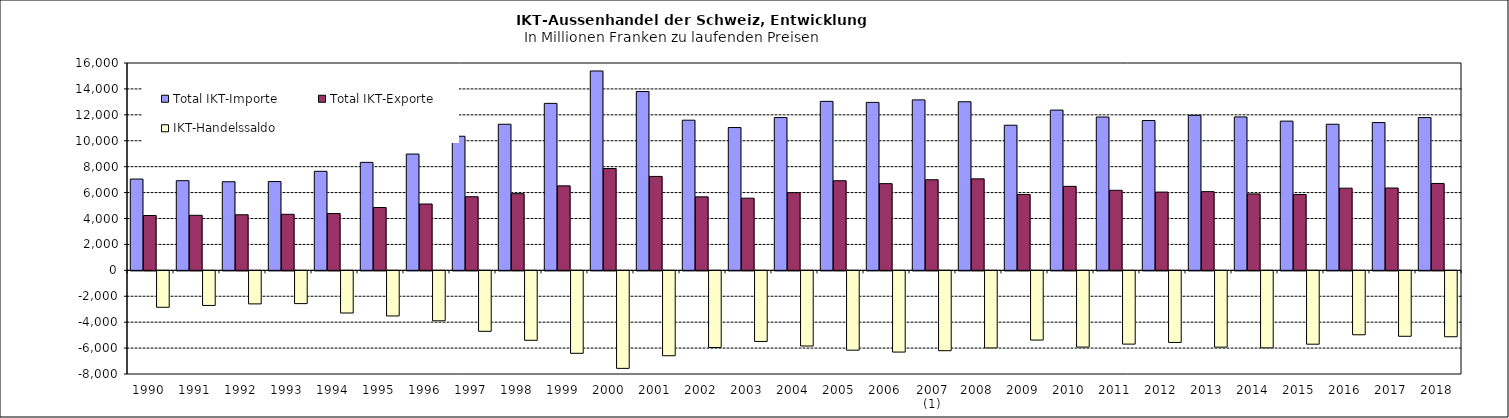
| Category | Total IKT-Importe | Total IKT-Exporte | IKT-Handelssaldo |
|---|---|---|---|
| 1990 | 7043.215 | 4231.191 | -2812.025 |
| 1991 | 6918.332 | 4246.634 | -2671.698 |
| 1992 | 6838.565 | 4288.681 | -2549.884 |
| 1993 | 6851.701 | 4323.053 | -2528.648 |
| 1994 | 7642.126 | 4387.76 | -3254.366 |
| 1995 | 8330.021 | 4847.542 | -3482.479 |
| 1996 | 8972.833 | 5116.856 | -3855.977 |
| 1997 | 10347.863 | 5680.291 | -4667.572 |
| 1998 | 11273.785 | 5913.959 | -5359.826 |
| 1999 | 12883.689 | 6518.032 | -6365.657 |
| 2000 | 15383.908 | 7857.447 | -7526.461 |
| 2001 | 13799.08 | 7246.555 | -6552.524 |
| 2002 | 11586.772 | 5669.087 | -5917.685 |
| 2003 | 11019.238 | 5568.629 | -5450.609 |
| 2004 | 11793.307 | 5992.472 | -5800.835 |
| 2005 | 13038.922 | 6915.251 | -6123.671 |
| 2006 | 12959.973 | 6690.613 | -6269.36 |
| 2007 (1) | 13153.755 | 6991.103 | -6162.652 |
| 2008 | 13008.083 | 7058.679 | -5949.405 |
| 2009 | 11198.456 | 5854.826 | -5343.63 |
| 2010 | 12364.801 | 6480.846 | -5883.955 |
| 2011 | 11831.733 | 6176.012 | -5655.721 |
| 2012 | 11561.378 | 6037.969 | -5523.409 |
| 2013 | 11962.779 | 6073.654 | -5889.124 |
| 2014 | 11838.141 | 5896.203 | -5941.938 |
| 2015 | 11514.94 | 5854.068 | -5660.872 |
| 2016 | 11273.944 | 6339.533 | -4934.411 |
| 2017 | 11404.313 | 6353.539 | -5050.773 |
| 2018 | 11791.067 | 6704.772 | -5086.295 |